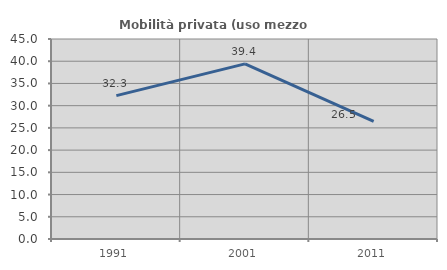
| Category | Mobilità privata (uso mezzo privato) |
|---|---|
| 1991.0 | 32.258 |
| 2001.0 | 39.394 |
| 2011.0 | 26.471 |